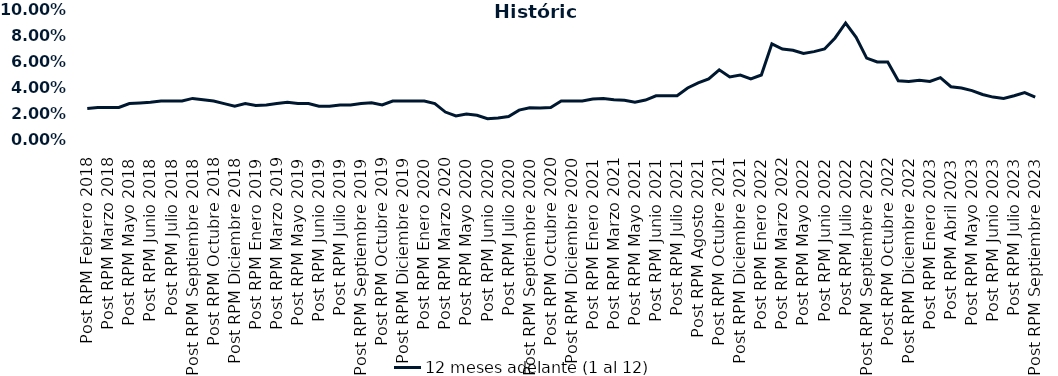
| Category | 12 meses adelante (1 al 12)  |
|---|---|
| Post RPM Febrero 2018 | 0.024 |
| Pre RPM Marzo 2018 | 0.025 |
| Post RPM Marzo 2018 | 0.025 |
| Pre RPM Mayo 2018 | 0.025 |
| Post RPM Mayo 2018 | 0.028 |
| Pre RPM Junio 2018 | 0.028 |
| Post RPM Junio 2018 | 0.029 |
| Pre RPM Julio 2018 | 0.03 |
| Post RPM Julio 2018 | 0.03 |
| Pre RPM Septiembre 2018 | 0.03 |
| Post RPM Septiembre 2018 | 0.032 |
| Pre RPM Octubre 2018 | 0.031 |
| Post RPM Octubre 2018 | 0.03 |
| Pre RPM Diciembre 2018 | 0.028 |
| Post RPM Diciembre 2018 | 0.026 |
| Pre RPM Enero 2019 | 0.028 |
| Post RPM Enero 2019 | 0.026 |
| Pre RPM Marzo 2019 | 0.027 |
| Post RPM Marzo 2019 | 0.028 |
| Pre RPM Mayo 2019 | 0.029 |
| Post RPM Mayo 2019 | 0.028 |
| Pre RPM Junio 2019 | 0.028 |
| Post RPM Junio 2019 | 0.026 |
| Pre RPM Julio 2019 | 0.026 |
| Post RPM Julio 2019 | 0.027 |
| Pre RPM Septiembre 2019 | 0.027 |
| Post RPM Septiembre 2019 | 0.028 |
| Pre RPM Octubre 2019 | 0.029 |
| Post RPM Octubre 2019 | 0.027 |
| Pre RPM Diciembre 2019 | 0.03 |
| Post RPM Diciembre 2019 | 0.03 |
| Pre RPM Enero 2020 | 0.03 |
| Post RPM Enero 2020 | 0.03 |
| Pre RPM Marzo 2020 | 0.028 |
| Post RPM Marzo 2020 | 0.022 |
| Pre RPM Mayo 2020 | 0.018 |
| Post RPM Mayo 2020 | 0.02 |
| Pre RPM Junio 2020 | 0.019 |
| Post RPM Junio 2020 | 0.016 |
| Pre RPM Julio 2020 | 0.017 |
| Post RPM Julio 2020 | 0.018 |
| Pre RPM Septiembre 2020 | 0.023 |
| Post RPM Septiembre 2020 | 0.025 |
| Pre RPM Octubre 2020 | 0.025 |
| Post RPM Octubre 2020 | 0.025 |
| Pre RPM Diciembre 2020 | 0.03 |
| Post RPM Diciembre 2020 | 0.03 |
| Pre RPM Enero 2021 | 0.03 |
| Post RPM Enero 2021 | 0.032 |
| Pre RPM Marzo 2021 | 0.032 |
| Post RPM Marzo 2021 | 0.031 |
| Pre RPM Mayo 2021 | 0.03 |
| Post RPM Mayo 2021 | 0.029 |
| Pre RPM Junio 2021 | 0.031 |
| Post RPM Junio 2021 | 0.034 |
| Pre RPM Julio 2021 | 0.034 |
| Post RPM Julio 2021 | 0.034 |
| Pre RPM Agosto 2021 | 0.04 |
| Post RPM Agosto 2021 | 0.044 |
| Pre RPM Octubre 2021 | 0.047 |
| Post RPM Octubre 2021 | 0.054 |
| Pre RPM Diciembre 2021 | 0.048 |
| Post RPM Diciembre 2021 | 0.05 |
| Pre RPM Enero 2022 | 0.047 |
| Post RPM Enero 2022 | 0.05 |
| Pre RPM Marzo 2022 | 0.074 |
| Post RPM Marzo 2022 | 0.07 |
| Pre RPM Mayo 2022 | 0.069 |
| Post RPM Mayo 2022 | 0.066 |
| Pre RPM Junio 2022 | 0.068 |
| Post RPM Junio 2022 | 0.07 |
| Pre RPM Julio 2022 | 0.078 |
| Post RPM Julio 2022 | 0.09 |
| Pre RPM Septiembre 2022 | 0.079 |
| Post RPM Septiembre 2022 | 0.063 |
| Pre RPM Octubre 2022 | 0.06 |
| Post RPM Octubre 2022 | 0.06 |
| Pre RPM Diciembre 2022 | 0.046 |
| Post RPM Diciembre 2022 | 0.045 |
| Pre RPM Enero 2023 | 0.046 |
| Post RPM Enero 2023 | 0.045 |
| Pre RPM Abril 2023 | 0.048 |
| Post RPM Abril 2023 | 0.041 |
| Pre RPM Mayo 2023 | 0.04 |
| Post RPM Mayo 2023 | 0.038 |
| Pre RPM Junio 2023 | 0.035 |
| Post RPM Junio 2023 | 0.033 |
| Pre RPM Julio 2023 | 0.032 |
| Post RPM Julio 2023 | 0.034 |
| Pre RPM Septiembre 2023 | 0.036 |
| Post RPM Septiembre 2023 | 0.033 |